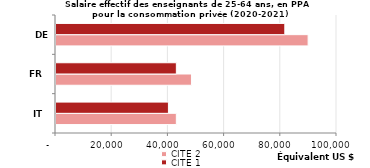
| Category | CITE 2 | CITE 1 |
|---|---|---|
| IT | 42822.44 | 40007.993 |
| FR | 48209.354 | 42832.429 |
| DE | 89721.573 | 81428.723 |